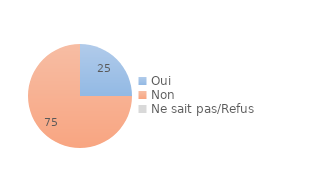
| Category | Series 0 |
|---|---|
| Oui | 25 |
| Non | 75 |
| Ne sait pas/Refus | 0 |